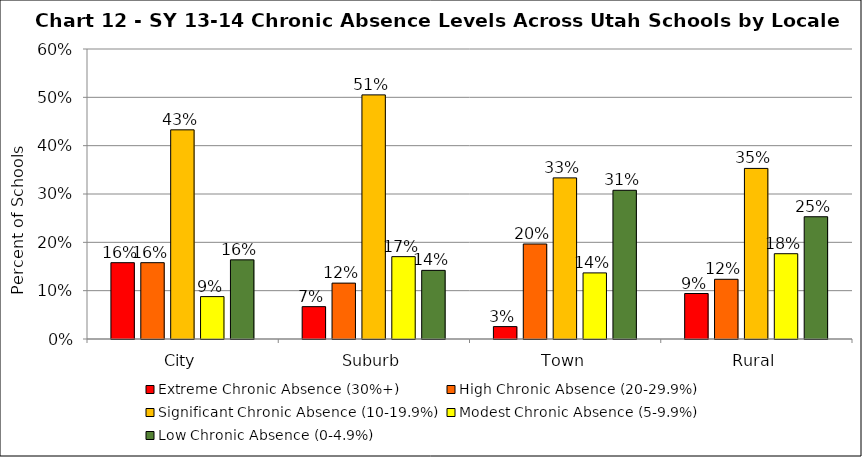
| Category | Extreme Chronic Absence (30%+) | High Chronic Absence (20-29.9%) | Significant Chronic Absence (10-19.9%) | Modest Chronic Absence (5-9.9%) | Low Chronic Absence (0-4.9%) |
|---|---|---|---|---|---|
| 0 | 0.158 | 0.158 | 0.433 | 0.088 | 0.164 |
| 1 | 0.067 | 0.116 | 0.505 | 0.17 | 0.142 |
| 2 | 0.026 | 0.197 | 0.333 | 0.137 | 0.308 |
| 3 | 0.094 | 0.124 | 0.353 | 0.176 | 0.253 |